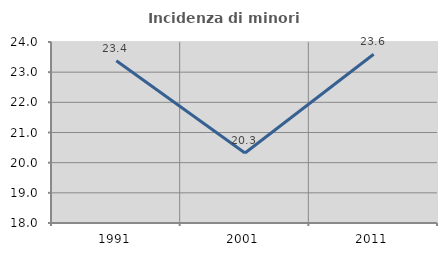
| Category | Incidenza di minori stranieri |
|---|---|
| 1991.0 | 23.377 |
| 2001.0 | 20.32 |
| 2011.0 | 23.595 |